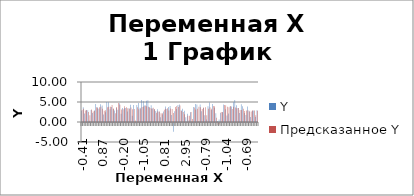
| Category | Y | Предсказанное Y |
|---|---|---|
| -0.41046 | 2.83 | 2.976 |
| 0.07032 | 3.67 | 3.342 |
| 1.01795 | 2.15 | 2.852 |
| -0.23696 | 3.02 | 2.944 |
| 0.45704 | 2.93 | 2.508 |
| 2.41152 | 0.32 | 1.675 |
| -0.02792 | 2.98 | 3.118 |
| 0.41871 | 2.22 | 2.602 |
| 0.80195 | 2.86 | 2.79 |
| -0.37736 | 4.52 | 3.679 |
| -0.14568 | 3.67 | 3.45 |
| 0.31873 | 3.33 | 3.68 |
| 0.03444 | 4.42 | 3.816 |
| 0.87128 | 4.15 | 3.312 |
| 0.85525 | 1.88 | 2.837 |
| 0.25218 | 2.41 | 2.909 |
| -0.98461 | 4.98 | 3.68 |
| -0.75641 | 4.91 | 3.795 |
| -0.59232 | 3.2 | 3.832 |
| -0.55748 | 3.75 | 4.234 |
| -0.21257 | 3.27 | 3.36 |
| 1.27611 | 2.89 | 2.184 |
| -0.93583 | 3.48 | 3.761 |
| -1.26506 | 3.08 | 4.749 |
| -0.59232 | 4.68 | 4.292 |
| -0.52612 | 2.06 | 3.152 |
| -0.20177 | 3.49 | 3.172 |
| -0.35855 | 3.44 | 3.955 |
| -0.76024 | 3.48 | 3.664 |
| 0.06614 | 2.6 | 3.466 |
| 0.12502 | 3.42 | 3.303 |
| -1.02781 | 4.33 | 3.611 |
| -0.58152 | 1.55 | 3.17 |
| -0.49895 | 4.27 | 3.257 |
| 2.94978 | -0.09 | 0.382 |
| -1.06753 | 4.25 | 3.658 |
| -0.40628 | 4.73 | 3.213 |
| -0.72157 | 3.56 | 3.401 |
| -0.66235 | 5.5 | 3.772 |
| -1.05045 | 5.17 | 3.899 |
| -0.36203 | 4.15 | 4.133 |
| -1.01074 | 5.3 | 3.918 |
| -0.83898 | 5.44 | 3.822 |
| -1.23273 | 3.72 | 3.525 |
| -1.08641 | 4.2 | 3.396 |
| -0.86344 | 3.38 | 3.549 |
| 0.14453 | 3.17 | 3.189 |
| 1.07369 | 2.74 | 2.338 |
| 0.28667 | 3.18 | 2.691 |
| 0.72565 | 2.54 | 2.648 |
| 1.31791 | 1.2 | 2.18 |
| 1.85444 | 1.85 | 2.158 |
| 0.81449 | 2.62 | 3.068 |
| 1.11062 | 3.89 | 3.295 |
| -0.93395 | 3.27 | 3.423 |
| -0.58138 | 3.75 | 2.854 |
| -0.69914 | 4.02 | 3.384 |
| -0.16679 | 1.74 | 3.225 |
| -0.13523 | -2.21 | 2.236 |
| -0.77697 | 2.66 | 3.727 |
| -0.75606 | 3.28 | 3.978 |
| -0.58222 | 4.22 | 3.748 |
| -0.33346 | 4.4 | 4.128 |
| 0.30375 | 2.91 | 2.769 |
| 1.56841 | 3.32 | 2.481 |
| 2.94804 | 2.82 | 1.937 |
| 3.84689 | 1.2 | 0.027 |
| 0.80195 | 2.08 | 1.579 |
| 0.94827 | 0.42 | 1.566 |
| 0.99008 | 2.45 | 2.529 |
| 4.04896 | -0.05 | 0.75 |
| -0.96796 | 3.75 | 3.625 |
| -0.4878 | 4.48 | 3.138 |
| -0.07956 | 4.38 | 3.302 |
| -0.64423 | 0.11 | 3.788 |
| -0.63552 | 4.39 | 3.668 |
| 0.61583 | 2.69 | 3.258 |
| -1.02781 | 3.49 | 3.608 |
| -0.78812 | 1.66 | 3.698 |
| 1.08763 | 0.63 | 1.701 |
| -0.40279 | 3.94 | 3.335 |
| -0.53449 | 4.88 | 3.659 |
| -0.14498 | 2.99 | 3.302 |
| -0.39896 | 4.53 | 3.983 |
| -0.25333 | 3.58 | 3.956 |
| 0.97823 | 2.2 | 1.09 |
| 3.04002 | 0.25 | -0.421 |
| 3.31524 | 0.62 | -0.366 |
| 0.3992 | 2.22 | 2.477 |
| -0.08994 | 2.49 | 2.428 |
| -1.16403 | 4.39 | 4.256 |
| -1.03512 | 3.2 | 4.213 |
| -0.91284 | 1.65 | 3.829 |
| -0.59615 | 2.14 | 3.684 |
| -0.86267 | 3.91 | 3.943 |
| -0.32719 | 3.85 | 3.255 |
| -0.9952 | 4.96 | 3.803 |
| -0.68792 | 5.51 | 3.632 |
| -0.12861 | 4.16 | 3.444 |
| -0.73272 | 3.5 | 3.507 |
| -0.87034 | 2.28 | 2.977 |
| -0.74491 | 4.43 | 3.025 |
| -0.43136 | 3.93 | 3.341 |
| -0.51567 | 2.26 | 2.758 |
| -0.68917 | 1.72 | 2.846 |
| -0.80066 | 3.9 | 2.911 |
| -0.27807 | 2.83 | 2.648 |
| -0.20839 | 1.27 | 2.612 |
| 0.00761 | 2.72 | 2.932 |
| 0.09819 | 2.86 | 2.887 |
| 1.26182 | 1.25 | 1.701 |
| 0.59988 | 2.94 | 2.824 |